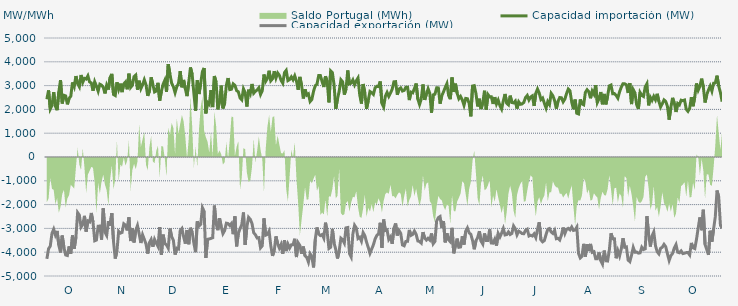
| Category | Capacidad importación (MW) | Capacidad exportación (MW) |
|---|---|---|
| 0 | 2427.5 | -4280 |
| 1900-01-01 | 2798 | -3856.875 |
| 1900-01-02 | 2018.125 | -3744.583 |
| 1900-01-03 | 2168.958 | -3208.75 |
| 1900-01-04 | 2728.125 | -3034.375 |
| 1900-01-05 | 2131.75 | -3278.125 |
| 1900-01-06 | 1966.875 | -3106.458 |
| 1900-01-07 | 2738.083 | -3703.375 |
| 1900-01-08 | 3229.167 | -4012.5 |
| 1900-01-09 | 2249.792 | -3300.833 |
| 1900-01-10 | 2592.917 | -3809.792 |
| 1900-01-11 | 2566.25 | -4116.667 |
| 1900-01-12 | 2212.5 | -4138.708 |
| 1900-01-13 | 2464.375 | -3755.833 |
| 1900-01-14 | 2551.042 | -4061.25 |
| 1900-01-15 | 3133.5 | -3295.833 |
| 1900-01-16 | 2953.75 | -3854.167 |
| 1900-01-17 | 3401.25 | -3375.917 |
| 1900-01-18 | 3082.5 | -2336.25 |
| 1900-01-19 | 2949.375 | -2439.375 |
| 1900-01-20 | 3446.25 | -2947.5 |
| 1900-01-21 | 3138.75 | -2840.625 |
| 1900-01-22 | 3305 | -2472.958 |
| 1900-01-23 | 3276.125 | -3134.625 |
| 1900-01-24 | 3410.625 | -2685.417 |
| 1900-01-25 | 3153.75 | -2727.292 |
| 1900-01-26 | 3110.625 | -2351.25 |
| 1900-01-27 | 2786.458 | -2737.5 |
| 1900-01-28 | 3159.375 | -3519.375 |
| 1900-01-29 | 2974.6 | -3488.4 |
| 1900-01-30 | 2766.667 | -2906.917 |
| 1900-01-31 | 3058.125 | -2902.5 |
| 1900-02-01 | 3018.75 | -3474.375 |
| 1900-02-02 | 2925.625 | -2158.375 |
| 1900-02-03 | 2670.667 | -3157.5 |
| 1900-02-04 | 3015 | -3296.25 |
| 1900-02-05 | 2835.25 | -2693.125 |
| 1900-02-06 | 3337.5 | -2882.083 |
| 1900-02-07 | 3493.125 | -2358.75 |
| 1900-02-08 | 2626.042 | -3555 |
| 1900-02-09 | 2583.542 | -4267.5 |
| 1900-02-10 | 3140.625 | -3948.75 |
| 1900-02-11 | 2844.375 | -3122.5 |
| 1900-02-12 | 3082.5 | -3200.625 |
| 1900-02-13 | 2726.25 | -3170.625 |
| 1900-02-14 | 3071.25 | -2806.875 |
| 1900-02-15 | 3151.875 | -2865 |
| 1900-02-16 | 2845.417 | -3084.375 |
| 1900-02-17 | 3500.625 | -2536.875 |
| 1900-02-18 | 2921.75 | -3531.625 |
| 1900-02-19 | 3012.625 | -2985.75 |
| 1900-02-20 | 3378.75 | -3590.625 |
| 1900-02-21 | 3442.5 | -3078.75 |
| 1900-02-22 | 2829.167 | -2881.042 |
| 1900-02-23 | 3205.833 | -3234.375 |
| 1900-02-24 | 2873.625 | -3613.125 |
| 1900-02-25 | 3038.333 | -3270 |
| 1900-02-26 | 3245.625 | -3459.375 |
| 1900-02-27 | 3029.167 | -3656.25 |
| 1900-02-28 | 2571.042 | -4057.5 |
| 1900-02-28 | 2766.125 | -3596.417 |
| 1900-03-01 | 3348.75 | -3465 |
| 1900-03-02 | 3046.333 | -3774.375 |
| 1900-03-03 | 2732.708 | -3460.042 |
| 1900-03-04 | 2770.75 | -3616.875 |
| 1900-03-05 | 3116.25 | -3757.75 |
| 1900-03-06 | 2370.5 | -2949.375 |
| 1900-03-07 | 2758.625 | -4102.5 |
| 1900-03-08 | 3054.167 | -3262.5 |
| 1900-03-09 | 3221.875 | -3637.5 |
| 1900-03-10 | 2734.792 | -3695.625 |
| 1900-03-11 | 3901.875 | -3830.625 |
| 1900-03-12 | 3478.125 | -3007.5 |
| 1900-03-13 | 3100.208 | -3343.125 |
| 1900-03-14 | 2951.458 | -3500.625 |
| 1900-03-15 | 2703.125 | -4100.625 |
| 1900-03-16 | 2949.667 | -3832.5 |
| 1900-03-17 | 3092.292 | -3864.375 |
| 1900-03-18 | 3609.375 | -3088.125 |
| 1900-03-19 | 2928.75 | -3003.75 |
| 1900-03-20 | 3238.333 | -3346.875 |
| 1900-03-21 | 2865.417 | -3639.375 |
| 1900-03-22 | 2557.917 | -3067.5 |
| 1900-03-23 | 3131.667 | -3665.625 |
| 1900-03-24 | 3761.25 | -2973.625 |
| 1900-03-25 | 3468.542 | -3153.75 |
| 1900-03-26 | 2673.75 | -3622.5 |
| 1900-03-27 | 1945.625 | -3999.375 |
| 1900-03-28 | 3222.083 | -2703.875 |
| 1900-03-29 | 2645.458 | -2900.625 |
| 1900-03-30 | 3097.5 | -2827.5 |
| 1900-03-31 | 3595.208 | -2128.75 |
| 1900-04-01 | 3741.458 | -2283.75 |
| 1900-04-02 | 1833.125 | -4242.5 |
| 1900-04-03 | 2294.25 | -3457.125 |
| 1900-04-04 | 2210.833 | -3444.375 |
| 1900-04-05 | 2808.75 | -3420 |
| 1900-04-06 | 2098.083 | -3391.875 |
| 1900-04-07 | 3404.792 | -2041.875 |
| 1900-04-08 | 3136.875 | -2790.292 |
| 1900-04-09 | 2001.25 | -3075.75 |
| 1900-04-10 | 2334.583 | -2570.625 |
| 1900-04-11 | 2998.542 | -2932.5 |
| 1900-04-12 | 2041.583 | -3219.375 |
| 1900-04-13 | 2261.875 | -3091.875 |
| 1900-04-14 | 3017.292 | -2780.625 |
| 1900-04-15 | 3316.667 | -2796 |
| 1900-04-16 | 2831.875 | -2880.375 |
| 1900-04-17 | 2848.875 | -2791.375 |
| 1900-04-18 | 3072.083 | -3242.5 |
| 1900-04-19 | 3008.75 | -2494.125 |
| 1900-04-20 | 2789.75 | -3753.75 |
| 1900-04-21 | 2740.75 | -3208.125 |
| 1900-04-22 | 2484.167 | -3015 |
| 1900-04-23 | 2405.083 | -2845.208 |
| 1900-04-24 | 2862.542 | -2330.625 |
| 1900-04-25 | 2704.875 | -3693.75 |
| 1900-04-26 | 2121.458 | -2932.25 |
| 1900-04-27 | 2826.875 | -2536.458 |
| 1900-04-28 | 2666.25 | -2617.875 |
| 1900-04-29 | 3068.375 | -2797.625 |
| 1900-04-30 | 2681.458 | -3181.875 |
| 1900-05-01 | 2762.167 | -3268.125 |
| 1900-05-02 | 2816.458 | -3403.125 |
| 1900-05-03 | 2908.75 | -3388.125 |
| 1900-05-04 | 2628.458 | -3817.5 |
| 1900-05-05 | 2784.5 | -3729.375 |
| 1900-05-06 | 3466.875 | -2575.375 |
| 1900-05-07 | 3180 | -3284.375 |
| 1900-05-08 | 3301.25 | -3251.25 |
| 1900-05-09 | 3624.375 | -3114.375 |
| 1900-05-10 | 3203.333 | -3733.125 |
| 1900-05-11 | 3288.125 | -4155 |
| 1900-05-12 | 3606.25 | -3943.125 |
| 1900-05-13 | 3313.75 | -3335.625 |
| 1900-05-14 | 3531.417 | -3646.875 |
| 1900-05-15 | 3433.125 | -3826.875 |
| 1900-05-16 | 3223.542 | -3673.333 |
| 1900-05-17 | 3103.75 | -4066.875 |
| 1900-05-18 | 3546.25 | -3496.875 |
| 1900-05-19 | 3638.5 | -3952.5 |
| 1900-05-20 | 3210 | -3661.875 |
| 1900-05-21 | 3255.417 | -3826.875 |
| 1900-05-22 | 3367.5 | -3690 |
| 1900-05-23 | 3244.5 | -3684.375 |
| 1900-05-24 | 3411.458 | -3435 |
| 1900-05-25 | 3192.708 | -4203.75 |
| 1900-05-26 | 2825 | -3605.625 |
| 1900-05-27 | 3365.667 | -3718.625 |
| 1900-05-28 | 3014.375 | -4063.125 |
| 1900-05-29 | 2458.292 | -3762 |
| 1900-05-30 | 2845.5 | -4151.25 |
| 1900-05-31 | 2597.292 | -4215 |
| 1900-06-01 | 2650.375 | -4415.625 |
| 1900-06-02 | 2331.042 | -4066.875 |
| 1900-06-03 | 2415.625 | -4185 |
| 1900-06-04 | 2763.875 | -4638.75 |
| 1900-06-05 | 2996.042 | -3465 |
| 1900-06-06 | 3054.375 | -2960.625 |
| 1900-06-07 | 3421.875 | -3238.875 |
| 1900-06-08 | 3422.25 | -3301.458 |
| 1900-06-09 | 3168.75 | -3257.708 |
| 1900-06-10 | 2940.75 | -3407.5 |
| 1900-06-11 | 3391.875 | -2758.75 |
| 1900-06-12 | 3159.375 | -3175.208 |
| 1900-06-13 | 2294.792 | -3843.75 |
| 1900-06-14 | 3620.625 | -3793.125 |
| 1900-06-15 | 3550.208 | -3016.875 |
| 1900-06-16 | 3036.458 | -3616.875 |
| 1900-06-17 | 2023.333 | -3886.25 |
| 1900-06-18 | 2440.208 | -4263.75 |
| 1900-06-19 | 2764.167 | -3943.125 |
| 1900-06-20 | 3245.625 | -3410.667 |
| 1900-06-21 | 3161.25 | -3470.625 |
| 1900-06-22 | 2621.458 | -3614.625 |
| 1900-06-23 | 2861.25 | -2975.958 |
| 1900-06-24 | 3635.217 | -2962.391 |
| 1900-06-25 | 3071.083 | -4052.75 |
| 1900-06-26 | 3103.625 | -4196.25 |
| 1900-06-27 | 3238.125 | -3235.75 |
| 1900-06-28 | 3031.875 | -2868.708 |
| 1900-06-29 | 3202.5 | -2981.292 |
| 1900-06-30 | 3320.625 | -3422.292 |
| 1900-07-01 | 2615.625 | -3370.417 |
| 1900-07-02 | 2244.375 | -3535.625 |
| 1900-07-03 | 3067.5 | -3176.25 |
| 1900-07-04 | 2692.458 | -3306.875 |
| 1900-07-05 | 2025 | -3576.042 |
| 1900-07-06 | 2373.833 | -3795 |
| 1900-07-07 | 2750.458 | -4045 |
| 1900-07-08 | 2704.167 | -3868.417 |
| 1900-07-09 | 2628.75 | -3691.667 |
| 1900-07-10 | 2910 | -3448.125 |
| 1900-07-11 | 2971.875 | -3293.375 |
| 1900-07-12 | 2958.5 | -3229.167 |
| 1900-07-13 | 3174.375 | -2764.583 |
| 1900-07-14 | 2253.75 | -3813.75 |
| 1900-07-15 | 2100 | -2628.667 |
| 1900-07-16 | 2557.5 | -3088.333 |
| 1900-07-17 | 2713.125 | -3062.25 |
| 1900-07-18 | 2546.875 | -3463.625 |
| 1900-07-19 | 2686.458 | -3359.458 |
| 1900-07-20 | 2850 | -3646.042 |
| 1900-07-21 | 3159.375 | -2992.292 |
| 1900-07-22 | 3166.875 | -2793.125 |
| 1900-07-23 | 2613.75 | -3298.833 |
| 1900-07-24 | 2857.5 | -3089.625 |
| 1900-07-25 | 2903.875 | -3210.125 |
| 1900-07-26 | 2772 | -3696.792 |
| 1900-07-27 | 2797.5 | -3731.25 |
| 1900-07-28 | 2930.625 | -3545.625 |
| 1900-07-29 | 2932.5 | -3541.875 |
| 1900-07-30 | 2390.625 | -3064.167 |
| 1900-07-31 | 2726.25 | -3293.333 |
| 1900-08-01 | 2694.375 | -3252.708 |
| 1900-08-02 | 2878.125 | -3111.875 |
| 1900-08-03 | 3088.125 | -3247.5 |
| 1900-08-04 | 2435.625 | -3528.958 |
| 1900-08-05 | 2206.875 | -3547.708 |
| 1900-08-06 | 2435.625 | -3618.75 |
| 1900-08-07 | 3046.875 | -3157.917 |
| 1900-08-08 | 2400 | -3406.875 |
| 1900-08-09 | 2640 | -3488.125 |
| 1900-08-10 | 2866.875 | -3413.542 |
| 1900-08-11 | 2675.625 | -3486.458 |
| 1900-08-12 | 1861.25 | -3211.667 |
| 1900-08-13 | 2611.875 | -3644.375 |
| 1900-08-14 | 2638.125 | -3547.083 |
| 1900-08-15 | 2906.25 | -2688.333 |
| 1900-08-16 | 2904.375 | -2549.583 |
| 1900-08-17 | 2240.625 | -2502.083 |
| 1900-08-18 | 2576.25 | -2981.667 |
| 1900-08-19 | 2732.25 | -2689.375 |
| 1900-08-20 | 2919.375 | -3586.875 |
| 1900-08-21 | 3078.75 | -3206.25 |
| 1900-08-22 | 2587.5 | -3481.875 |
| 1900-08-23 | 2430 | -3560.625 |
| 1900-08-24 | 3341.25 | -2977.542 |
| 1900-08-25 | 2733.75 | -4046.25 |
| 1900-08-26 | 3080.625 | -3725.417 |
| 1900-08-27 | 2681.25 | -3429.375 |
| 1900-08-28 | 2448.75 | -3793.125 |
| 1900-08-29 | 2544.125 | -3778.125 |
| 1900-08-30 | 2394.958 | -3328.125 |
| 1900-08-31 | 2175 | -3678.75 |
| 1900-09-01 | 2461.167 | -3117.375 |
| 1900-09-02 | 2448.75 | -2981.542 |
| 1900-09-03 | 2255.042 | -3185.833 |
| 1900-09-04 | 1708.042 | -3250.208 |
| 1900-09-05 | 2981.25 | -3508.125 |
| 1900-09-06 | 2998.125 | -3877.5 |
| 1900-09-07 | 2664.375 | -3519.375 |
| 1900-09-08 | 2124.375 | -3382.5 |
| 1900-09-09 | 2446.875 | -3115.792 |
| 1900-09-10 | 2015.417 | -3534.375 |
| 1900-09-11 | 2289.375 | -3658.125 |
| 1900-09-12 | 2784.375 | -3211.083 |
| 1900-09-13 | 1993.125 | -3504.792 |
| 1900-09-14 | 2624.875 | -3506.458 |
| 1900-09-15 | 2523.75 | -3042.583 |
| 1900-09-16 | 2531.25 | -3613.125 |
| 1900-09-17 | 2229.583 | -3620.625 |
| 1900-09-18 | 2515.875 | -3455.625 |
| 1900-09-19 | 2227.5 | -3723.75 |
| 1900-09-20 | 2388.375 | -3217.458 |
| 1900-09-21 | 2157.875 | -3361.542 |
| 1900-09-22 | 2014.583 | -3202.708 |
| 1900-09-23 | 2357.917 | -3006.583 |
| 1900-09-24 | 2647.75 | -3275.625 |
| 1900-09-25 | 2259.375 | -3258.75 |
| 1900-09-26 | 2191.875 | -3148.125 |
| 1900-09-27 | 2578.125 | -3256.875 |
| 1900-09-28 | 2289.375 | -3211.875 |
| 1900-09-29 | 2272.917 | -2898.25 |
| 1900-09-30 | 2349.75 | -3012.25 |
| 1900-10-01 | 2034.167 | -3270 |
| 1900-10-02 | 2319.375 | -3116.25 |
| 1900-10-03 | 2214.375 | -3159.375 |
| 1900-10-04 | 2229.167 | -3217.5 |
| 1900-10-05 | 2296.875 | -3223.125 |
| 1900-10-06 | 2497.5 | -3080.208 |
| 1900-10-07 | 2585.5 | -3034.292 |
| 1900-10-08 | 2394.375 | -3318.75 |
| 1900-10-09 | 2520 | -3286.875 |
| 1900-10-10 | 2570.625 | -3320.625 |
| 1900-10-11 | 2145 | -3229.583 |
| 1900-10-12 | 2673.75 | -3384.375 |
| 1900-10-13 | 2855.625 | -3040.333 |
| 1900-10-14 | 2689.875 | -2741.708 |
| 1900-10-15 | 2413.125 | -3485.625 |
| 1900-10-16 | 2476.875 | -3564.375 |
| 1900-10-17 | 2258.75 | -3510 |
| 1900-10-18 | 2056.875 | -3258.75 |
| 1900-10-19 | 2326.875 | -3036.667 |
| 1900-10-20 | 2203.125 | -3003.75 |
| 1900-10-21 | 2675.333 | -3153.417 |
| 1900-10-22 | 2572.5 | -3211.875 |
| 1900-10-23 | 2368.125 | -3082.917 |
| 1900-10-24 | 2032.5 | -3433.125 |
| 1900-10-25 | 2340 | -3418.125 |
| 1900-10-26 | 2499.375 | -3485.625 |
| 1900-10-27 | 2488.125 | -3277.5 |
| 1900-10-28 | 2317.5 | -2963.167 |
| 1900-10-29 | 2431.875 | -3217.5 |
| 1900-10-30 | 2668.125 | -3039.375 |
| 1900-10-31 | 2855.625 | -2998.125 |
| 1900-11-01 | 2778.75 | -3061.667 |
| 1900-11-02 | 2311.875 | -2941.042 |
| 1900-11-03 | 2010 | -3084.375 |
| 1900-11-04 | 2411.25 | -3065.625 |
| 1900-11-05 | 1837.917 | -2945.625 |
| 1900-11-06 | 1809.167 | -4055.625 |
| 1900-11-07 | 2419.792 | -4241.25 |
| 1900-11-08 | 2227.5 | -4173.75 |
| 1900-11-09 | 2191.875 | -3648.75 |
| 1900-11-10 | 2715 | -4183.125 |
| 1900-11-11 | 2826.625 | -3667.292 |
| 1900-11-12 | 2745 | -3950.625 |
| 1900-11-13 | 2467.5 | -3652.625 |
| 1900-11-14 | 2771.25 | -4006.875 |
| 1900-11-15 | 2640 | -3980.625 |
| 1900-11-16 | 3016.875 | -4271.25 |
| 1900-11-17 | 2292.292 | -4271.25 |
| 1900-11-18 | 2448.75 | -4010.625 |
| 1900-11-19 | 2730 | -4357.5 |
| 1900-11-20 | 2214.75 | -4501.875 |
| 1900-11-21 | 2650.208 | -3931.667 |
| 1900-11-22 | 2212.5 | -4361.25 |
| 1900-11-23 | 2565 | -4370.625 |
| 1900-11-24 | 2988.75 | -3920.625 |
| 1900-11-25 | 3024.375 | -3204.083 |
| 1900-11-26 | 2656.875 | -3437.708 |
| 1900-11-27 | 2664.375 | -3437.5 |
| 1900-11-28 | 2587.5 | -4254.375 |
| 1900-11-29 | 2473.125 | -3939.583 |
| 1900-11-30 | 2737.5 | -4156.875 |
| 1900-12-01 | 2932.5 | -3862.5 |
| 1900-12-02 | 3080.625 | -3412.708 |
| 1900-12-03 | 3078.125 | -3793.125 |
| 1900-12-04 | 3031.25 | -3776.25 |
| 1900-12-05 | 2689.875 | -4331.25 |
| 1900-12-06 | 3104.042 | -4396.875 |
| 1900-12-07 | 2223.25 | -4126.875 |
| 1900-12-08 | 2830.208 | -3799.583 |
| 1900-12-09 | 2694.375 | -3999.792 |
| 1900-12-10 | 2193.542 | -3994.167 |
| 1900-12-11 | 2019.375 | -4039.792 |
| 1900-12-12 | 2710.792 | -4026.667 |
| 1900-12-13 | 2589.292 | -3790.625 |
| 1900-12-14 | 2542.5 | -3888.75 |
| 1900-12-15 | 2943.75 | -3856.875 |
| 1900-12-16 | 3076.875 | -2486 |
| 1900-12-17 | 2169.583 | -3271.875 |
| 1900-12-18 | 2510.875 | -3762.292 |
| 1900-12-19 | 2379.375 | -3315.625 |
| 1900-12-20 | 2548.125 | -3149.875 |
| 1900-12-21 | 2405.625 | -3725.625 |
| 1900-12-22 | 2655.792 | -3978.75 |
| 1900-12-23 | 2338.917 | -4070.625 |
| 1900-12-24 | 2100.75 | -3836.25 |
| 1900-12-25 | 2239.583 | -3791.25 |
| 1900-12-26 | 2398.417 | -3671.25 |
| 1900-12-27 | 2333.375 | -3772.5 |
| 1900-12-28 | 2128.125 | -4065 |
| 1900-12-29 | 1568.375 | -4348.125 |
| 1900-12-30 | 2080.083 | -4146.125 |
| 1900-12-31 | 2486.208 | -4052.083 |
| 1901-01-01 | 2275.5 | -3824.583 |
| 1901-01-02 | 1891.708 | -3681.25 |
| 1901-01-03 | 2248.292 | -4001.25 |
| 1901-01-04 | 2190.75 | -4023.75 |
| 1901-01-05 | 2386.583 | -3945 |
| 1901-01-06 | 2366.708 | -4057.5 |
| 1901-01-07 | 2393.375 | -4042.25 |
| 1901-01-08 | 2007.375 | -4017.708 |
| 1901-01-09 | 1918.833 | -4016.25 |
| 1901-01-10 | 2042.417 | -4115.625 |
| 1901-01-11 | 2516.25 | -3611.25 |
| 1901-01-12 | 2132.708 | -3815.625 |
| 1901-01-13 | 2530.208 | -3849.375 |
| 1901-01-14 | 3090 | -3459.375 |
| 1901-01-15 | 2808.75 | -2974.875 |
| 1901-01-16 | 2978.125 | -2539.125 |
| 1901-01-17 | 3292.5 | -3075.208 |
| 1901-01-18 | 2935 | -2217.083 |
| 1901-01-19 | 2289.583 | -3673.125 |
| 1901-01-20 | 2619.375 | -3890.625 |
| 1901-01-21 | 2814.792 | -4110 |
| 1901-01-22 | 2979.375 | -3099.375 |
| 1901-01-23 | 2767.5 | -3556.875 |
| 1901-01-24 | 3099.375 | -3031.875 |
| 1901-01-25 | 3111.25 | -2508.75 |
| 1901-01-26 | 3418.125 | -1406.875 |
| 1901-01-27 | 2979.6 | -1681.6 |
| 1901-01-28 | 2705.333 | -2868.75 |
| 1901-01-29 | 2324.458 | -2999 |